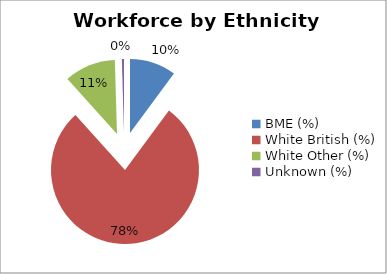
| Category | Series 0 |
|---|---|
| BME (%) | 10.12 |
| White British (%)  | 78.198 |
| White Other (%) | 11.215 |
| Unknown (%) | 0.467 |